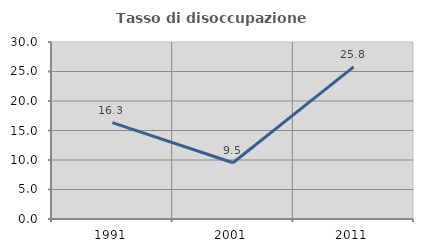
| Category | Tasso di disoccupazione giovanile  |
|---|---|
| 1991.0 | 16.344 |
| 2001.0 | 9.532 |
| 2011.0 | 25.776 |